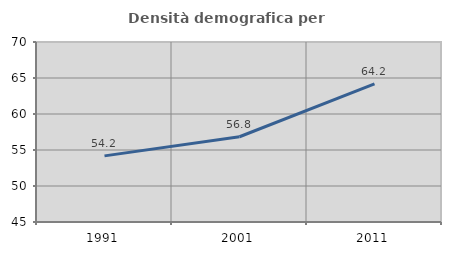
| Category | Densità demografica |
|---|---|
| 1991.0 | 54.184 |
| 2001.0 | 56.841 |
| 2011.0 | 64.177 |